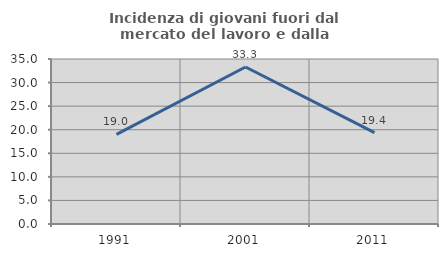
| Category | Incidenza di giovani fuori dal mercato del lavoro e dalla formazione  |
|---|---|
| 1991.0 | 19.021 |
| 2001.0 | 33.31 |
| 2011.0 | 19.388 |